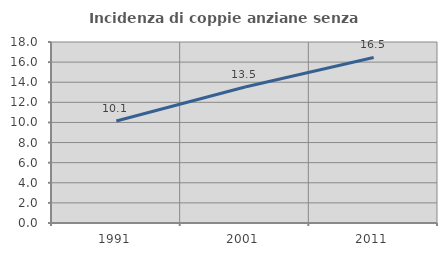
| Category | Incidenza di coppie anziane senza figli  |
|---|---|
| 1991.0 | 10.139 |
| 2001.0 | 13.53 |
| 2011.0 | 16.464 |